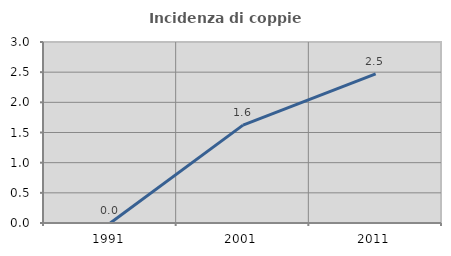
| Category | Incidenza di coppie miste |
|---|---|
| 1991.0 | 0 |
| 2001.0 | 1.622 |
| 2011.0 | 2.473 |